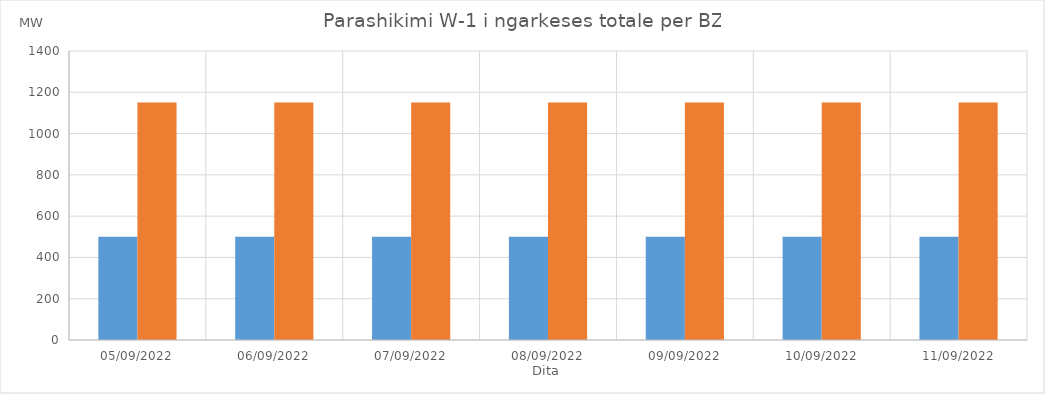
| Category | Min (MW) | Max (MW) |
|---|---|---|
| 05/09/2022 | 500 | 1150 |
| 06/09/2022 | 500 | 1150 |
| 07/09/2022 | 500 | 1150 |
| 08/09/2022 | 500 | 1150 |
| 09/09/2022 | 500 | 1150 |
| 10/09/2022 | 500 | 1150 |
| 11/09/2022 | 500 | 1150 |